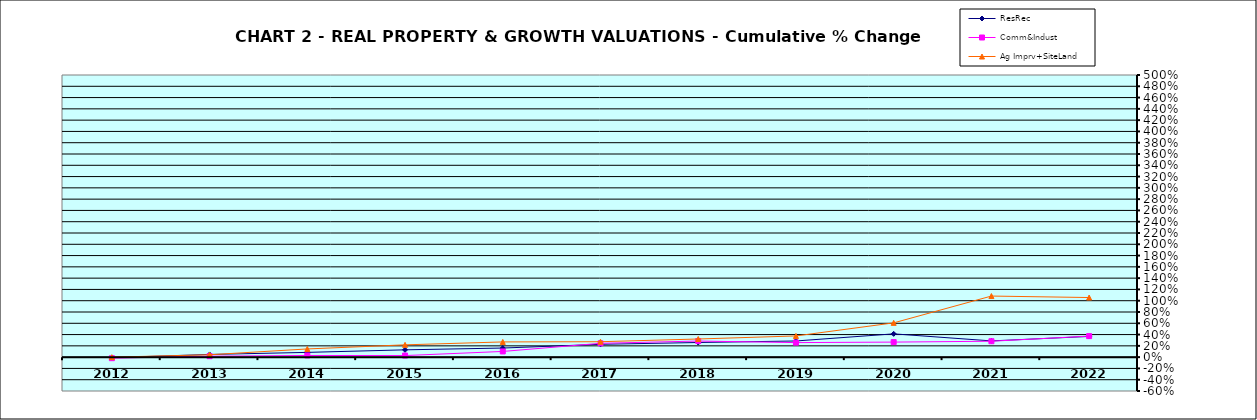
| Category | ResRec | Comm&Indust | Ag Imprv+SiteLand |
|---|---|---|---|
| 2012.0 | -0.008 | -0.018 | 0 |
| 2013.0 | 0.048 | 0.017 | 0.042 |
| 2014.0 | 0.084 | 0.029 | 0.145 |
| 2015.0 | 0.129 | 0.028 | 0.218 |
| 2016.0 | 0.161 | 0.101 | 0.27 |
| 2017.0 | 0.228 | 0.245 | 0.274 |
| 2018.0 | 0.259 | 0.285 | 0.322 |
| 2019.0 | 0.286 | 0.258 | 0.376 |
| 2020.0 | 0.413 | 0.267 | 0.607 |
| 2021.0 | 0.288 | 0.282 | 1.082 |
| 2022.0 | 0.367 | 0.373 | 1.056 |